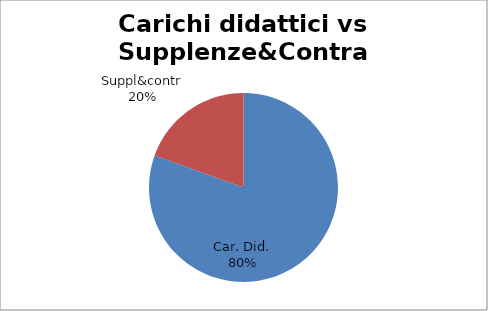
| Category | Series 0 |
|---|---|
| Car. Did. | 0.805 |
| Suppl&contr | 0.195 |